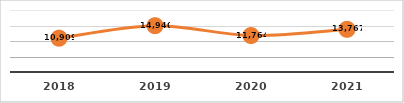
| Category | PERSONAS CAPACITADAS
PRIMER TRIMESTRE, EJERCICIO 2021 |
|---|---|
| 2018.0 | 10909 |
| 2019.0 | 14940 |
| 2020.0 | 11764 |
| 2021.0 | 13767 |